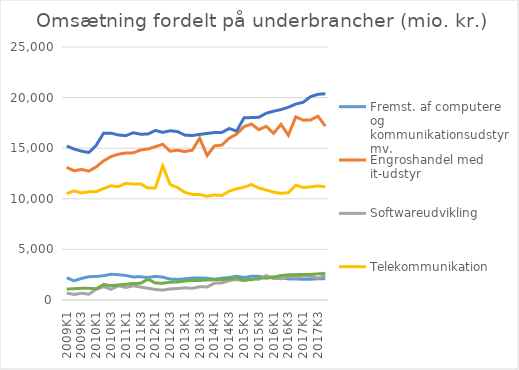
| Category | Fremst. af computere og kommunikationsudstyr mv. | Engroshandel med it-udstyr | Softwareudvikling | Telekommunikation | It-konsulenter mv. | Informationstjenester |
|---|---|---|---|---|---|---|
| 2009K1 | 2200.982 | 13098.104 | 683.936 | 10511.25 | 15215.928 | 1082.934 |
| 2009K2 | 1893.744 | 12768.575 | 548.509 | 10778.81 | 14915.149 | 1119.803 |
| 2009K3 | 2128.374 | 12904.538 | 665.519 | 10582 | 14708.345 | 1152.495 |
| 2009K4 | 2303.749 | 12734.748 | 571.277 | 10689.819 | 14574.775 | 1157.445 |
| 2010K1 | 2320.663 | 13160.602 | 1063.509 | 10701.852 | 15295.791 | 1112.354 |
| 2010K2 | 2397.393 | 13751.16 | 1322.955 | 11016.816 | 16489.341 | 1539.717 |
| 2010K3 | 2542.644 | 14172.453 | 1052.18 | 11287.468 | 16483.452 | 1417.064 |
| 2010K4 | 2501.102 | 14405.576 | 1410.086 | 11202.088 | 16304.597 | 1484.533 |
| 2011K1 | 2417.816 | 14527.474 | 1238.743 | 11530.16 | 16238.224 | 1555.633 |
| 2011K2 | 2282.013 | 14539.649 | 1409.582 | 11457.852 | 16527.096 | 1621.049 |
| 2011K3 | 2289.52 | 14825.163 | 1278.228 | 11467.469 | 16379.961 | 1654.827 |
| 2011K4 | 2221.547 | 14919.841 | 1157.742 | 11061.954 | 16403.026 | 2062.397 |
| 2012K1 | 2333.448 | 15149.865 | 1042.726 | 11063.63 | 16752.837 | 1679.849 |
| 2012K2 | 2263.203 | 15391.134 | 979.763 | 13242.415 | 16565.931 | 1653.353 |
| 2012K3 | 2065.117 | 14701.294 | 1088.895 | 11409.35 | 16723.284 | 1760.328 |
| 2012K4 | 2032.46 | 14798.918 | 1137.721 | 11107.025 | 16643.944 | 1781.769 |
| 2013K1 | 2091.52 | 14663.008 | 1202.99 | 10638.111 | 16287.971 | 1867.888 |
| 2013K2 | 2172.039 | 14804.532 | 1158.657 | 10436.33 | 16251.208 | 1938.516 |
| 2013K3 | 2176.459 | 15991.743 | 1304.248 | 10434.777 | 16363.336 | 1930.485 |
| 2013K4 | 2150.01 | 14273.57 | 1292.285 | 10250.08 | 16456.32 | 1975.964 |
| 2014K1 | 2051.744 | 15223.176 | 1659.66 | 10377.204 | 16542.653 | 1995.307 |
| 2014K2 | 2152.68 | 15308.06 | 1688.256 | 10326.527 | 16557.518 | 2032.149 |
| 2014K3 | 2218.09 | 15991.83 | 1920.612 | 10753.669 | 16948.164 | 2050.228 |
| 2014K4 | 2348.342 | 16394.779 | 2019.825 | 10991.982 | 16684.254 | 2219.395 |
| 2015K1 | 2224.262 | 17126.624 | 1903.501 | 11146.61 | 18005.261 | 1977.292 |
| 2015K2 | 2340.113 | 17392.91 | 2103.146 | 11406.485 | 18025.283 | 2003.401 |
| 2015K3 | 2335.11 | 16833.821 | 2042.721 | 11065.201 | 18053.143 | 2196.208 |
| 2015K4 | 2226.935 | 17158.69 | 2419.615 | 10870.244 | 18452.434 | 2156.259 |
| 2016K1 | 2275.868 | 16465.267 | 2118.338 | 10655.151 | 18657.736 | 2249.752 |
| 2016K2 | 2192.278 | 17352.834 | 2109.465 | 10536.383 | 18817.402 | 2416.157 |
| 2016K3 | 2087.397 | 16288.682 | 2338.406 | 10598.874 | 19044.644 | 2484.989 |
| 2016K4 | 2082.477 | 18091.485 | 2212.725 | 11342.971 | 19359.928 | 2510.783 |
| 2017K1 | 2041.361 | 17771.242 | 2379.58 | 11117.145 | 19536.772 | 2529.474 |
| 2017K2 | 2047.594 | 17786.424 | 2329.848 | 11175.98 | 20093.61 | 2528.301 |
| 2017K3 | 2096.924 | 18164.098 | 2156.75 | 11268.003 | 20324.283 | 2577.316 |
| 2017K4 | 2097.63 | 17187.241 | 2419.716 | 11189.849 | 20380.446 | 2641.062 |